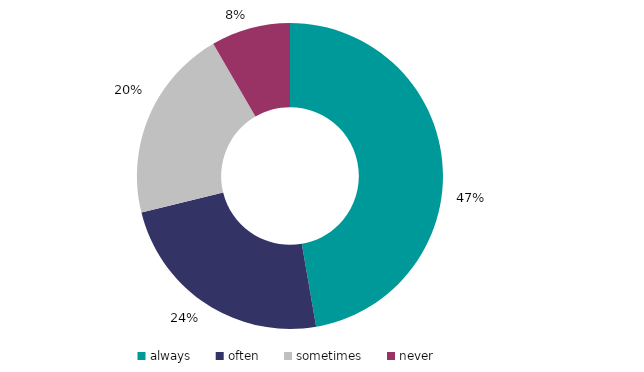
| Category | Series 1 |
|---|---|
| always | 47.264 |
| often | 23.891 |
| sometimes | 20.48 |
| never | 8.366 |